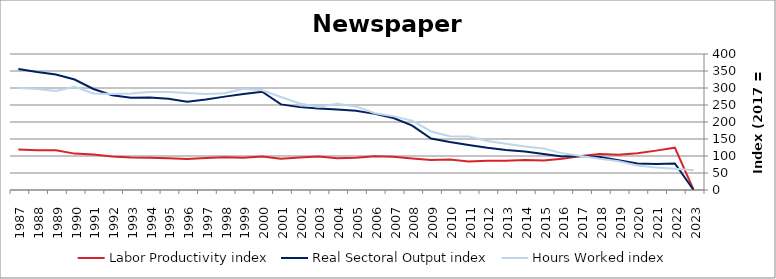
| Category | Labor Productivity index | Real Sectoral Output index | Hours Worked index |
|---|---|---|---|
| 2023.0 | 0 | 0 | 57.78 |
| 2022.0 | 124.574 | 77.859 | 62.5 |
| 2021.0 | 115.774 | 76.217 | 65.833 |
| 2020.0 | 107.997 | 77.978 | 72.204 |
| 2019.0 | 103.425 | 87.69 | 84.786 |
| 2018.0 | 105.587 | 96.893 | 91.766 |
| 2017.0 | 100 | 100 | 100 |
| 2016.0 | 91.575 | 98.686 | 107.766 |
| 2015.0 | 86.868 | 105.831 | 121.83 |
| 2014.0 | 88.431 | 113.101 | 127.898 |
| 2013.0 | 86.372 | 117.71 | 136.282 |
| 2012.0 | 86.093 | 124.094 | 144.14 |
| 2011.0 | 83.94 | 132.377 | 157.705 |
| 2010.0 | 89.365 | 141.224 | 158.031 |
| 2009.0 | 87.939 | 151.337 | 172.092 |
| 2008.0 | 92.824 | 189.342 | 203.981 |
| 2007.0 | 97.786 | 211.718 | 216.512 |
| 2006.0 | 99.234 | 223.86 | 225.587 |
| 2005.0 | 94.772 | 233.031 | 245.886 |
| 2004.0 | 93.354 | 236.684 | 253.535 |
| 2003.0 | 98.182 | 239.793 | 244.233 |
| 2002.0 | 95.706 | 243.735 | 254.671 |
| 2001.0 | 92.007 | 251.712 | 273.581 |
| 2000.0 | 98.568 | 289.089 | 293.289 |
| 1999.0 | 94.866 | 282.346 | 297.628 |
| 1998.0 | 96.443 | 274.616 | 284.744 |
| 1997.0 | 94.276 | 266.308 | 282.477 |
| 1996.0 | 91.027 | 259.776 | 285.382 |
| 1995.0 | 93.098 | 268.066 | 287.941 |
| 1994.0 | 94.567 | 272.393 | 288.043 |
| 1993.0 | 95.698 | 271.491 | 283.696 |
| 1992.0 | 98.668 | 278.471 | 282.229 |
| 1991.0 | 104.733 | 297.09 | 283.664 |
| 1990.0 | 107.018 | 324.926 | 303.617 |
| 1989.0 | 116.723 | 339.654 | 290.992 |
| 1988.0 | 116.739 | 346.992 | 297.237 |
| 1987.0 | 118.79 | 356.005 | 299.692 |